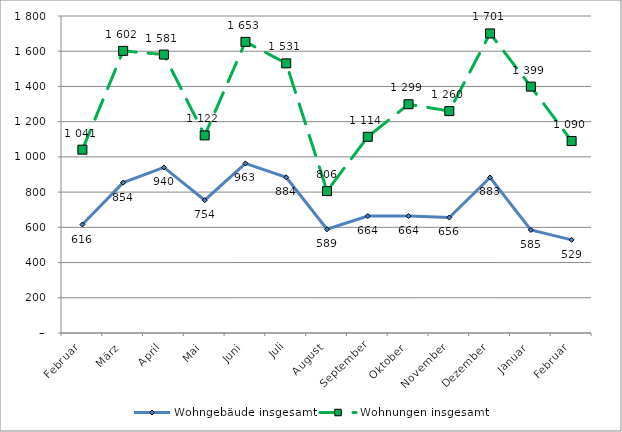
| Category | Wohngebäude insgesamt | Wohnungen insgesamt |
|---|---|---|
| Februar | 616 | 1041 |
| März | 854 | 1602 |
| April | 940 | 1581 |
| Mai | 754 | 1122 |
| Juni | 963 | 1653 |
| Juli | 884 | 1531 |
| August | 589 | 806 |
| September | 664 | 1114 |
| Oktober | 664 | 1299 |
| November | 656 | 1260 |
| Dezember | 883 | 1701 |
| Januar | 585 | 1399 |
| Februar | 529 | 1090 |